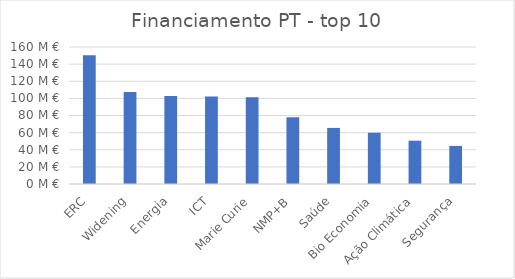
| Category | Financiamento PT |
|---|---|
| ERC | 150237208.17 |
| Widening | 107501482.51 |
| Energia | 102829945.73 |
| ICT | 102149573.4 |
| Marie Curie | 101260312.71 |
| NMP+B | 78037815.53 |
| Saúde | 65479491.2 |
| Bio Economia | 59824963.79 |
| Ação Climática | 50595164.06 |
| Segurança | 44471933.38 |